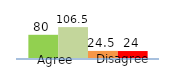
| Category | Series 0 | Series 1 | Series 2 | Series 3 |
|---|---|---|---|---|
| 0 | 80 | 106.5 | 24.5 | 24 |